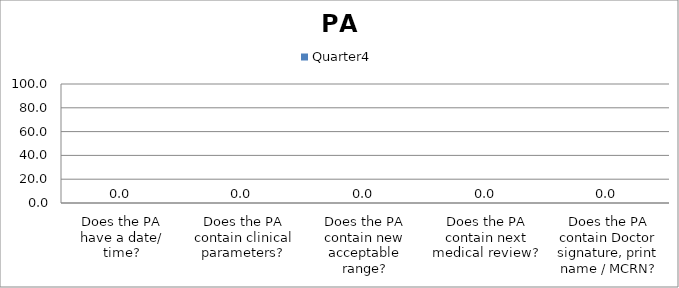
| Category | Quarter4 |
|---|---|
| Does the PA have a date/ time? | 0 |
| Does the PA contain clinical parameters? | 0 |
| Does the PA contain new acceptable range? | 0 |
| Does the PA contain next medical review? | 0 |
| Does the PA contain Doctor signature, print name / MCRN? | 0 |